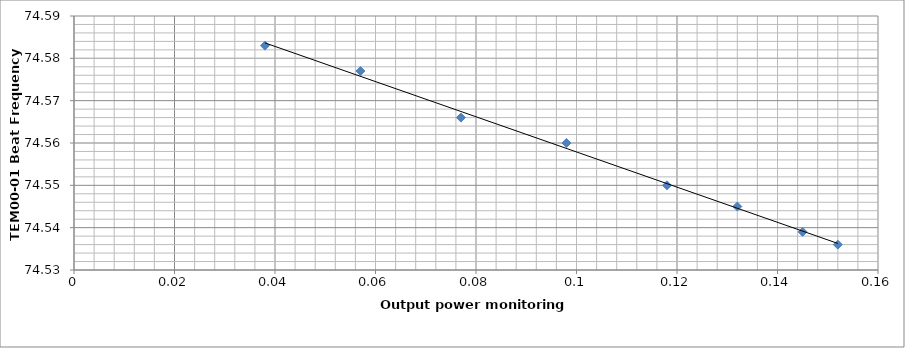
| Category | Series 0 |
|---|---|
| 0.152 | 74.536 |
| 0.145 | 74.539 |
| 0.132 | 74.545 |
| 0.118 | 74.55 |
| 0.098 | 74.56 |
| 0.077 | 74.566 |
| 0.057 | 74.577 |
| 0.038 | 74.583 |